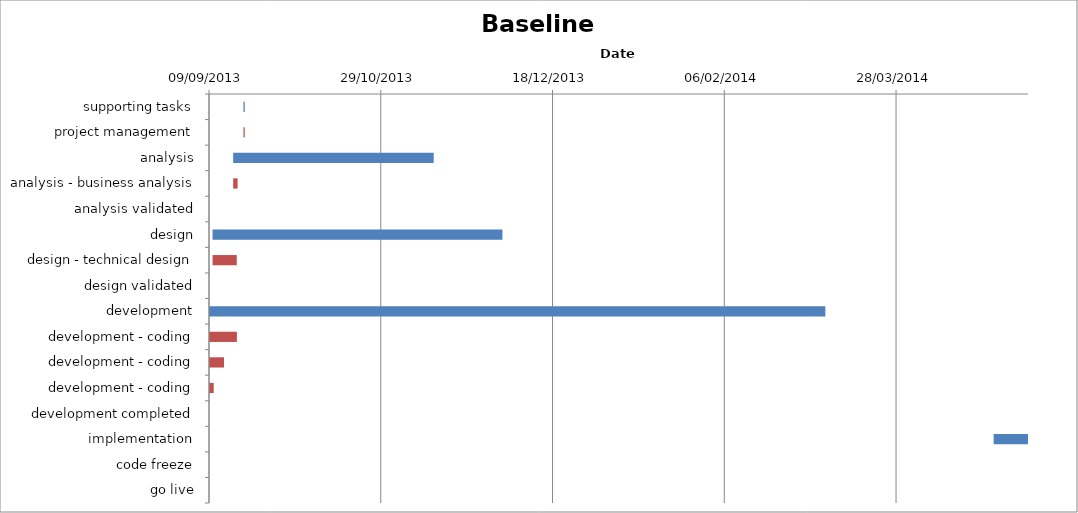
| Category | Baseline start | Actual duration |
|---|---|---|
| supporting tasks | 41536.333 | 0.375 |
| project management | 41536.333 | 0.375 |
| analysis | 41533.333 | 58.375 |
| analysis - business analysis | 41533.333 | 1.292 |
| analysis validated | 41591.708 | 0 |
| design | 41527.333 | 84.375 |
| design - technical design | 41527.333 | 7.042 |
| design validated | 41611.708 | 0 |
| development | 41526.333 | 179.375 |
| development - coding | 41526.333 | 8.083 |
| development - coding | 41526.333 | 4.333 |
| development - coding | 41526.333 | 1.333 |
| development completed | 41705.708 | 0 |
| implementation | 41754.708 | 10 |
| code freeze | 41754.708 | 0 |
| go live | 41764.708 | 0 |